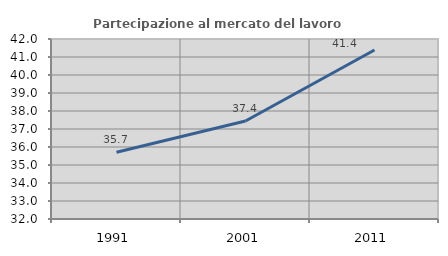
| Category | Partecipazione al mercato del lavoro  femminile |
|---|---|
| 1991.0 | 35.706 |
| 2001.0 | 37.443 |
| 2011.0 | 41.387 |